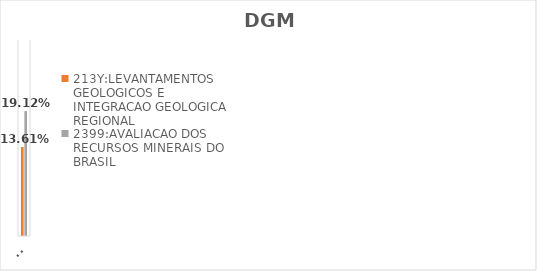
| Category | 213Y:LEVANTAMENTOS GEOLOGICOS E INTEGRACAO GEOLOGICA REGIONAL | 2399:AVALIACAO DOS RECURSOS MINERAIS DO BRASIL |
|---|---|---|
| EXECUTADO | 0.136 | 0.191 |